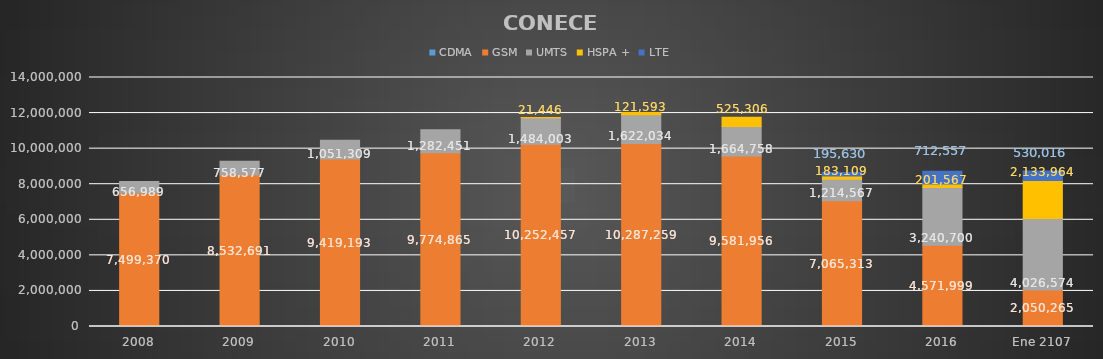
| Category | CDMA | GSM | UMTS | HSPA + | LTE |
|---|---|---|---|---|---|
| 2008 | 0 | 7499370 | 656989 | 0 | 0 |
| 2009 | 0 | 8532691 | 758577 | 0 | 0 |
| 2010 | 0 | 9419193 | 1051309 | 0 | 0 |
| 2011 | 0 | 9774865 | 1282451 | 0 | 0 |
| 2012 | 0 | 10252457 | 1484003 | 21446 | 0 |
| 2013 | 0 | 10287259 | 1622034 | 121593 | 0 |
| 2014 | 0 | 9581956 | 1664758 | 525306 | 0 |
| 2015 | 0 | 7065313 | 1214567 | 183109 | 195630 |
| 2016 | 0 | 4571999 | 3240700 | 201567 | 712557 |
| Ene 2107 | 0 | 2050264.931 | 4026574 | 2133964 | 530016 |